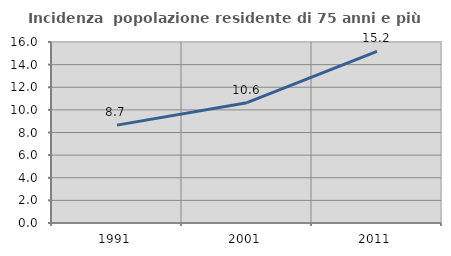
| Category | Incidenza  popolazione residente di 75 anni e più |
|---|---|
| 1991.0 | 8.652 |
| 2001.0 | 10.632 |
| 2011.0 | 15.166 |